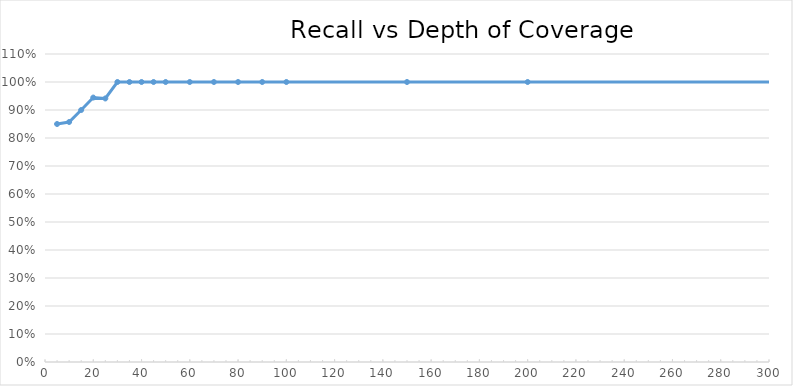
| Category | Series 1 |
|---|---|
| 5.0 | 0.85 |
| 10.0 | 0.857 |
| 15.0 | 0.9 |
| 20.0 | 0.944 |
| 25.0 | 0.941 |
| 30.0 | 1 |
| 35.0 | 1 |
| 40.0 | 1 |
| 45.0 | 1 |
| 50.0 | 1 |
| 60.0 | 1 |
| 70.0 | 1 |
| 80.0 | 1 |
| 90.0 | 1 |
| 100.0 | 1 |
| 150.0 | 1 |
| 200.0 | 1 |
| 500.0 | 1 |
| 1000.0 | 1 |
| 2000.0 | 1 |